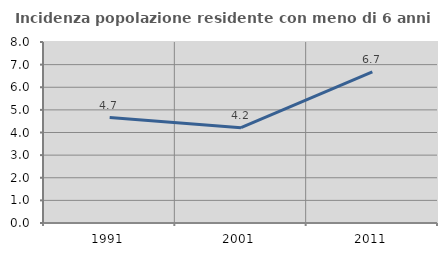
| Category | Incidenza popolazione residente con meno di 6 anni |
|---|---|
| 1991.0 | 4.659 |
| 2001.0 | 4.211 |
| 2011.0 | 6.678 |